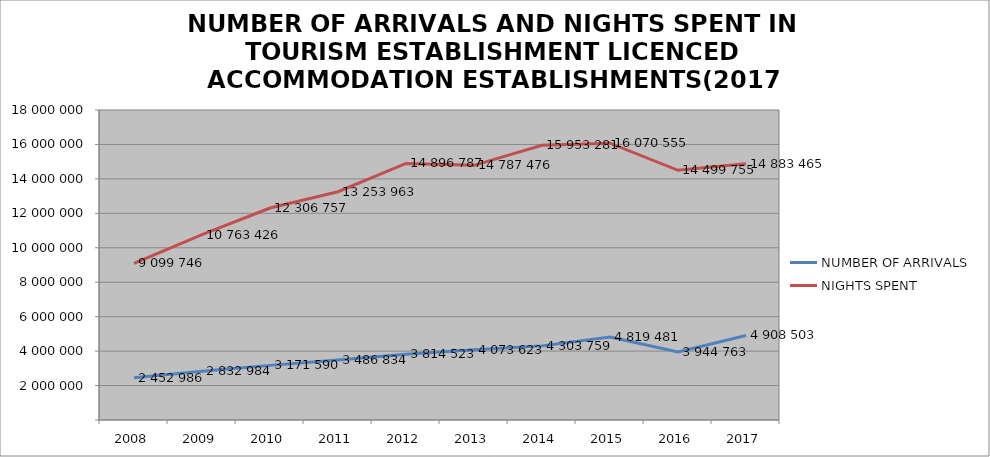
| Category | NUMBER OF ARRIVALS | NIGHTS SPENT |
|---|---|---|
| 2008 | 2452986 | 9099746 |
| 2009 | 2832984 | 10763426 |
| 2010 | 3171590 | 12306757 |
| 2011 | 3486834 | 13253963 |
| 2012 | 3814523 | 14896787 |
| 2013 | 4073623 | 14787476 |
| 2014 | 4303759 | 15953281 |
| 2015 | 4819481 | 16070555 |
| 2016 | 3944763 | 14499755 |
| 2017 | 4908503 | 14883465 |